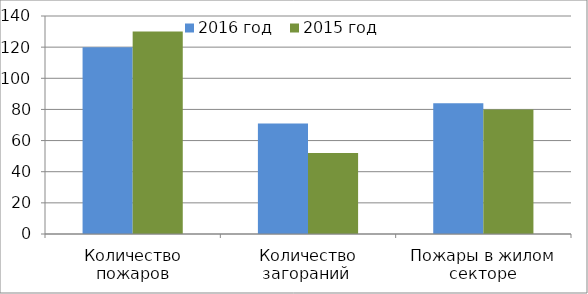
| Category | 2016 год | 2015 год |
|---|---|---|
| Количество пожаров | 120 | 130 |
| Количество загораний  | 71 | 52 |
| Пожары в жилом секторе | 84 | 80 |